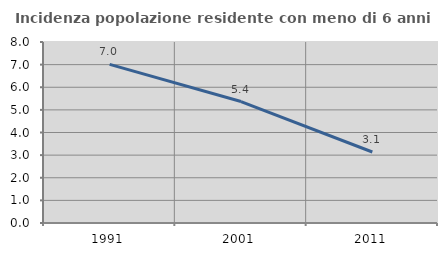
| Category | Incidenza popolazione residente con meno di 6 anni |
|---|---|
| 1991.0 | 7.012 |
| 2001.0 | 5.369 |
| 2011.0 | 3.139 |